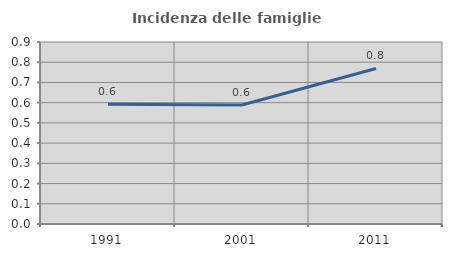
| Category | Incidenza delle famiglie numerose |
|---|---|
| 1991.0 | 0.593 |
| 2001.0 | 0.588 |
| 2011.0 | 0.769 |